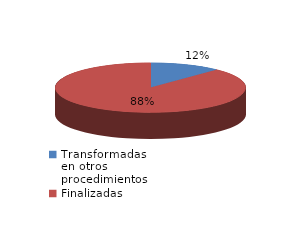
| Category | Series 0 |
|---|---|
| Transformadas en otros procedimientos | 3090 |
| Finalizadas | 22463 |